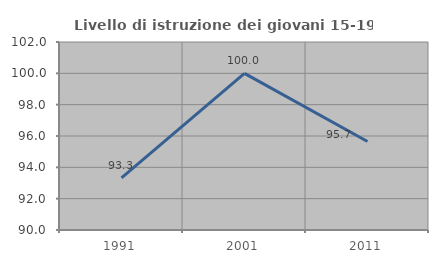
| Category | Livello di istruzione dei giovani 15-19 anni |
|---|---|
| 1991.0 | 93.333 |
| 2001.0 | 100 |
| 2011.0 | 95.652 |